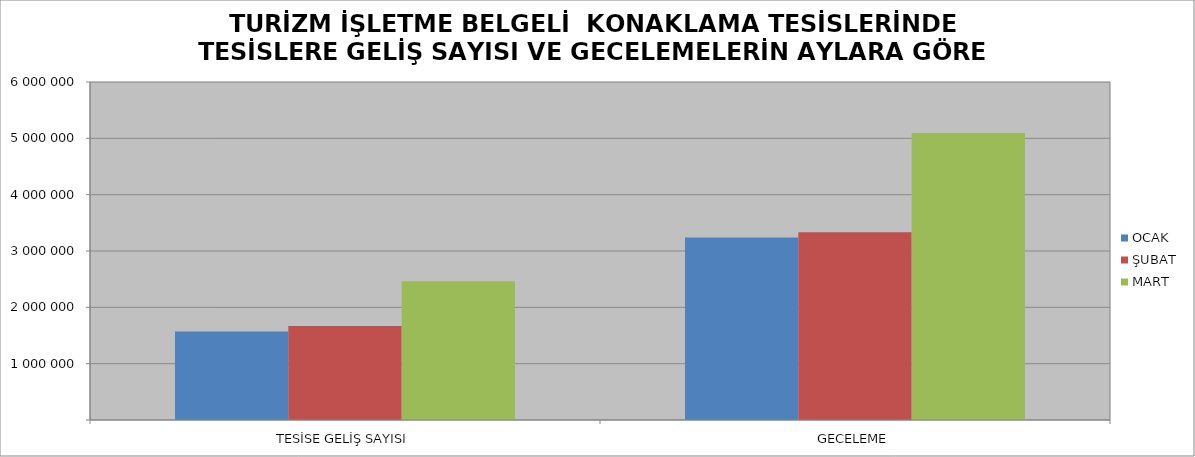
| Category | OCAK | ŞUBAT | MART |
|---|---|---|---|
| TESİSE GELİŞ SAYISI | 1571594 | 1670164 | 2462715 |
| GECELEME | 3239980 | 3333484 | 5094921 |